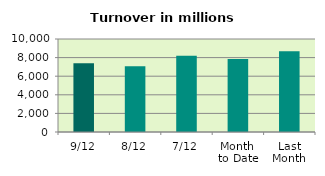
| Category | Series 0 |
|---|---|
| 9/12 | 7404.736 |
| 8/12 | 7081.445 |
| 7/12 | 8200.964 |
| Month 
to Date | 7847.905 |
| Last
Month | 8686.894 |